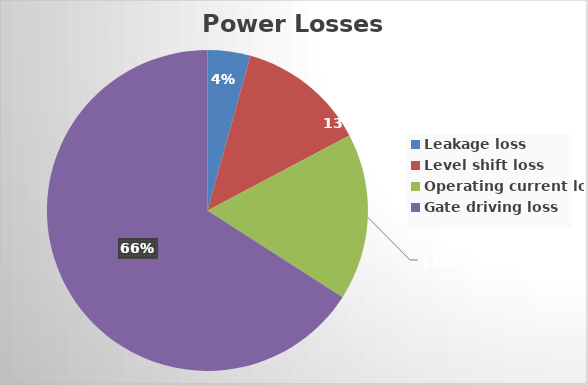
| Category | Series 0 |
|---|---|
| Leakage loss | 20.95 |
| Level shift loss | 62.85 |
| Operating current loss | 81.66 |
| Gate driving loss | 320 |